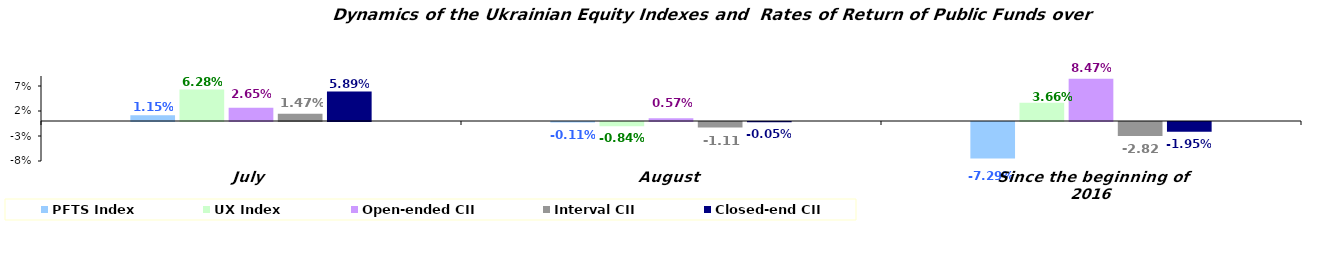
| Category | PFTS Index | UX Index | Open-ended CII | Interval CII | Closed-end CII |
|---|---|---|---|---|---|
| July | 0.011 | 0.063 | 0.027 | 0.015 | 0.059 |
| August | -0.001 | -0.008 | 0.006 | -0.011 | -0.001 |
| Since the beginning of 2016 | -0.073 | 0.037 | 0.085 | -0.028 | -0.02 |